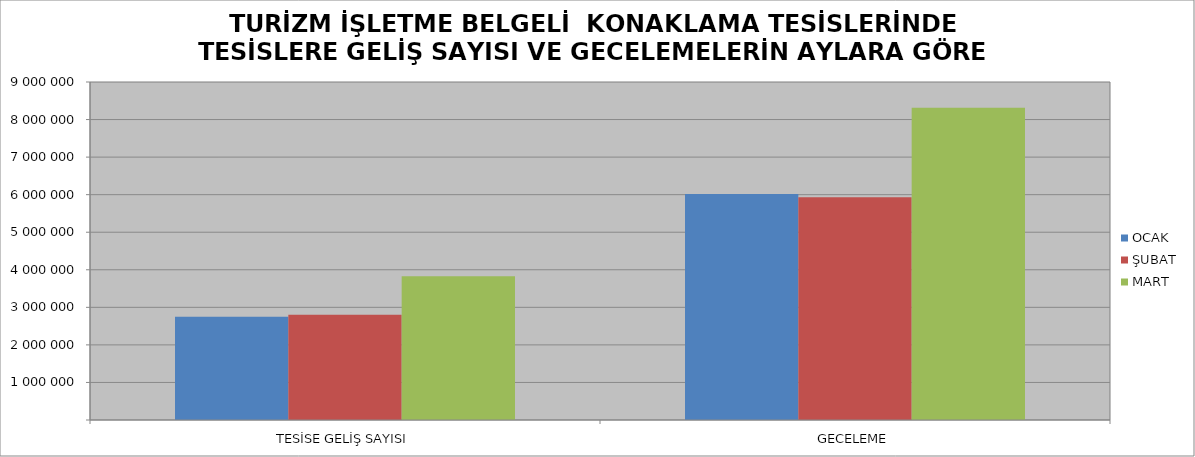
| Category | OCAK | ŞUBAT | MART |
|---|---|---|---|
| TESİSE GELİŞ SAYISI | 2752012 | 2800059 | 3828458 |
| GECELEME | 6020345 | 5929648 | 8312048 |